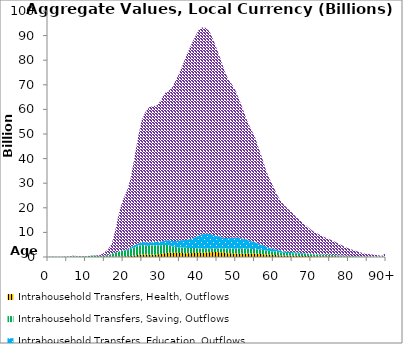
| Category | Intrahousehold Transfers, Health, Outflows | Intrahousehold Transfers, Saving, Outflows | Intrahousehold Transfers, Education, Outflows | Intrahousehold Transfers, Consumption other than health and education, Outflows |
|---|---|---|---|---|
| 0 | 0 | 127.958 | 0 | 0.984 |
|  | 0 | 161.459 | 0 | 1.236 |
| 2 | 0 | 125.361 | 0 | 0.96 |
| 3 | 0 | 52.39 | 0.049 | 15.583 |
| 4 | 0.14 | 60.654 | 0.133 | 74.944 |
| 5 | 0.355 | 176.059 | 0.168 | 132.532 |
| 6 | 0.41 | 290.957 | 0.313 | 148.483 |
| 7 | 0.369 | 348.719 | 0.474 | 134.576 |
| 8 | 0.131 | 343.143 | 0.532 | 74.24 |
| 9 | 0.275 | 265.627 | 0.6 | 51.284 |
| 10 | 1.102 | 295.573 | 0.709 | 50.85 |
| 11 | 2.197 | 418.734 | 1.051 | 67.128 |
| 12 | 2.528 | 627.949 | 1.398 | 104.291 |
| 13 | 1.597 | 618.588 | 1.346 | 157.572 |
| 14 | 1.69 | 444.928 | 1.579 | 441.889 |
| 15 | 9.392 | 529.013 | 4.756 | 1308.215 |
| 16 | 31.875 | 775.757 | 9.062 | 2301.308 |
| 17 | 60.221 | 1121.644 | 24.227 | 4244.241 |
| 18 | 128.88 | 1691.998 | 43.648 | 9512.213 |
| 19 | 198.061 | 2036.014 | 82.656 | 16280.431 |
| 20 | 245.358 | 2312.719 | 160.541 | 20760.091 |
| 21 | 287.238 | 2373.794 | 297.497 | 23761.974 |
| 22 | 404.465 | 2838.608 | 522.419 | 28229.289 |
| 23 | 603.63 | 3346.695 | 813.791 | 35477.111 |
| 24 | 828.97 | 3637.829 | 1024.09 | 43395.373 |
| 25 | 997.267 | 3893.907 | 1216.881 | 49788.131 |
| 26 | 978.382 | 3730.862 | 1240.608 | 53124.407 |
| 27 | 923.942 | 3551.796 | 1271.456 | 55274.817 |
| 28 | 895.059 | 3852.166 | 1427.139 | 55175.993 |
| 29 | 995.194 | 3803.154 | 1439.202 | 55367.665 |
| 30 | 1259.367 | 3505.146 | 1491.704 | 57316.369 |
| 31 | 1493.1 | 3440.656 | 1708.453 | 59859.238 |
| 32 | 1645.554 | 3188.573 | 1959.615 | 60576.062 |
| 33 | 1759.179 | 2599.074 | 2190.938 | 62342.044 |
| 34 | 1735.283 | 2293.261 | 2475.681 | 65395.589 |
| 35 | 1616.31 | 2325.704 | 2761.149 | 68314.208 |
| 36 | 1571.133 | 2258.37 | 3058.895 | 71661.968 |
| 37 | 1560.414 | 2136.3 | 3267.61 | 75517.317 |
| 38 | 1565.786 | 2122.32 | 3645.615 | 78555.635 |
| 39 | 1625.541 | 2037.168 | 4291.979 | 81103.506 |
| 40 | 1638.362 | 1910.939 | 5070.83 | 83386.899 |
| 41 | 1711.165 | 1693.842 | 5761.953 | 84125.275 |
| 42 | 1839.727 | 1542.351 | 6129.48 | 83628.151 |
| 43 | 1902.055 | 1423.048 | 6061.811 | 82316.593 |
| 44 | 1996.134 | 1356.311 | 5611.661 | 79379.016 |
| 45 | 2000.581 | 1405.017 | 5129.814 | 75860.216 |
| 46 | 1908.938 | 1571.817 | 4644.651 | 72236.198 |
| 47 | 1698.362 | 1768.939 | 4335.492 | 67902.223 |
| 48 | 1517.348 | 1834.874 | 4308.895 | 64565.105 |
| 49 | 1470.409 | 1889.705 | 4616.145 | 62150.072 |
| 50 | 1379.283 | 1957.526 | 4635.633 | 59445.754 |
| 51 | 1266.351 | 2100.193 | 4367.801 | 55946.16 |
| 52 | 1278.533 | 2133.897 | 3999.351 | 52265.983 |
| 53 | 1352.399 | 2011.733 | 3594.132 | 48541.416 |
| 54 | 1384.222 | 1914.644 | 3218.558 | 45597.492 |
| 55 | 1375.393 | 1867.186 | 2861.234 | 43106.208 |
| 56 | 1293.448 | 1793.091 | 2387.532 | 39261.844 |
| 57 | 1190.763 | 1722.199 | 1975.62 | 35460.148 |
| 58 | 1046.27 | 1618.14 | 1511.588 | 31343.963 |
| 59 | 920.028 | 1547.515 | 1211.991 | 28030.894 |
| 60 | 827.368 | 1438.479 | 1043.959 | 25418.778 |
| 61 | 732.483 | 1307.053 | 867.564 | 22347.427 |
| 62 | 658.936 | 1180.036 | 719.476 | 20177.185 |
| 63 | 613.331 | 1069.894 | 608.078 | 18622.47 |
| 64 | 575.496 | 1028.39 | 516.433 | 17294.663 |
| 65 | 548.325 | 1012.537 | 434.517 | 16060.43 |
| 66 | 478.904 | 998.319 | 386.118 | 14508.23 |
| 67 | 442.754 | 939.456 | 337.962 | 13316.374 |
| 68 | 415.406 | 885.859 | 267.983 | 12197.096 |
| 69 | 383.605 | 819.214 | 225.606 | 10994.989 |
| 70 | 352.341 | 753.845 | 179.787 | 9855.072 |
| 71 | 332.198 | 709.906 | 147.565 | 8842.918 |
| 72 | 323.04 | 669.847 | 127.413 | 8193.117 |
| 73 | 309.394 | 619.998 | 105.395 | 7479.43 |
| 74 | 296.103 | 582.102 | 91.346 | 6804.81 |
| 75 | 285.96 | 550.694 | 78.178 | 6259.061 |
| 76 | 271.599 | 516.84 | 64.954 | 5674.918 |
| 77 | 244.72 | 471.422 | 51.255 | 4942.32 |
| 78 | 207.208 | 429.623 | 41.885 | 4256.533 |
| 79 | 170.597 | 377.25 | 33.257 | 3557.55 |
| 80 | 141.185 | 335.747 | 27.637 | 3021.687 |
| 81 | 114.768 | 293.885 | 22.834 | 2531.034 |
| 82 | 91.438 | 254.04 | 18.607 | 2095.657 |
| 83 | 68.437 | 209.341 | 14.581 | 1651.555 |
| 84 | 49.37 | 169.223 | 11.092 | 1267.606 |
| 85 | 38.364 | 151.367 | 9.229 | 1067.836 |
| 86 | 28.42 | 135.583 | 7.905 | 896.445 |
| 87 | 19.118 | 117.191 | 6.427 | 716.113 |
| 88 | 11.631 | 100.651 | 4.982 | 558.348 |
| 89 | 5.442 | 82.299 | 3.602 | 407.316 |
| 90+ | 5.552 | 332.783 | 13.124 | 1436.497 |